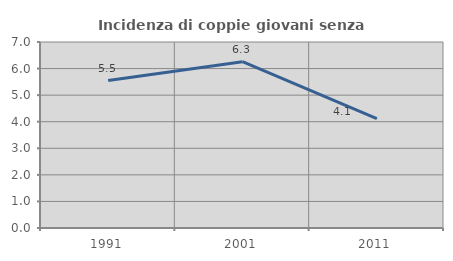
| Category | Incidenza di coppie giovani senza figli |
|---|---|
| 1991.0 | 5.548 |
| 2001.0 | 6.258 |
| 2011.0 | 4.115 |